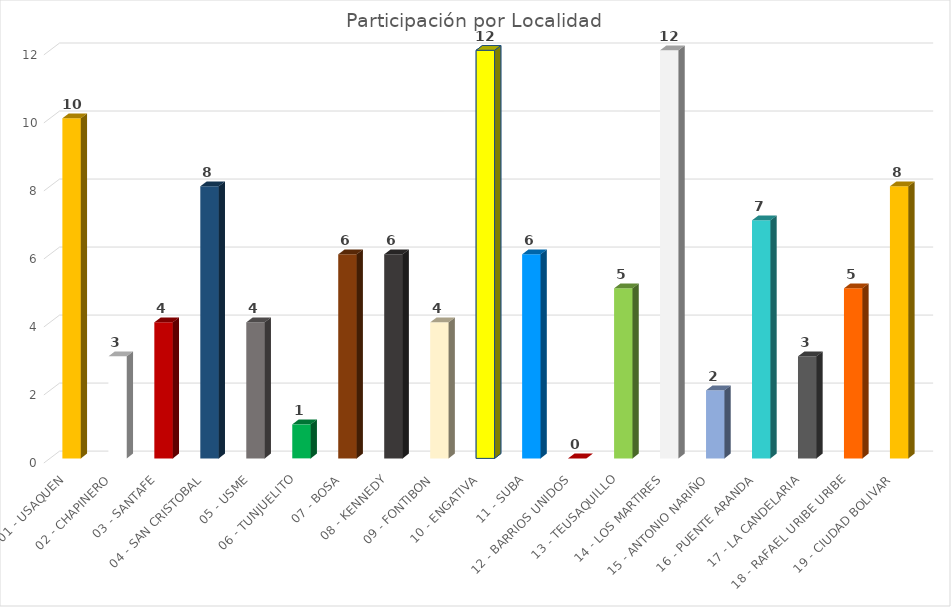
| Category | Peticiones |
|---|---|
| 01 - USAQUEN | 10 |
| 02 - CHAPINERO | 3 |
| 03 - SANTAFE | 4 |
| 04 - SAN CRISTOBAL | 8 |
| 05 - USME | 4 |
| 06 - TUNJUELITO | 1 |
| 07 - BOSA | 6 |
| 08 - KENNEDY | 6 |
| 09 - FONTIBON | 4 |
| 10 - ENGATIVA | 12 |
| 11 - SUBA | 6 |
| 12 - BARRIOS UNIDOS | 0 |
| 13 - TEUSAQUILLO | 5 |
| 14 - LOS MARTIRES | 12 |
| 15 - ANTONIO NARIÑO | 2 |
| 16 - PUENTE ARANDA | 7 |
| 17 - LA CANDELARIA | 3 |
| 18 - RAFAEL URIBE URIBE | 5 |
| 19 - CIUDAD BOLIVAR | 8 |